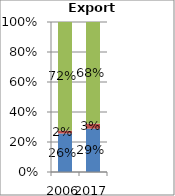
| Category | Agriculture | Fuels and mining | Manufacturing |
|---|---|---|---|
| 2006.0 | 0.257 | 0.02 | 0.723 |
| 2017.0 | 0.289 | 0.034 | 0.677 |